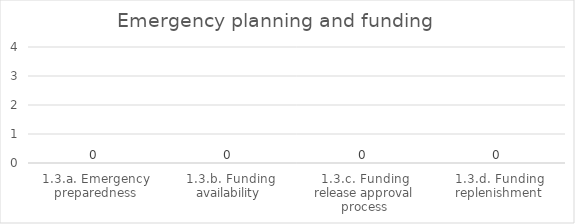
| Category | Emergency planning and funding |
|---|---|
| 1.3.a. Emergency preparedness | 0 |
| 1.3.b. Funding availability | 0 |
| 1.3.c. Funding release approval process | 0 |
| 1.3.d. Funding replenishment | 0 |